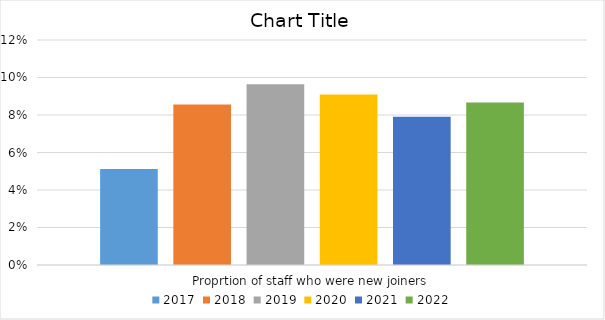
| Category | 2017 | 2018 | 2019 | 2020 | 2021 | 2022 |
|---|---|---|---|---|---|---|
| Proprtion of staff who were new joiners | 0.051 | 0.086 | 0.096 | 0.091 | 0.079 | 0.087 |